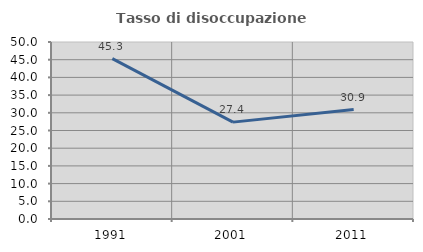
| Category | Tasso di disoccupazione giovanile  |
|---|---|
| 1991.0 | 45.304 |
| 2001.0 | 27.364 |
| 2011.0 | 30.909 |